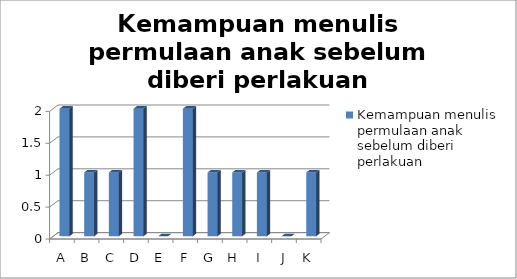
| Category | Kemampuan menulis permulaan anak sebelum diberi perlakuan |
|---|---|
| A | 2 |
| B | 1 |
| C | 1 |
| D | 2 |
| E | 0 |
| F | 2 |
| G | 1 |
| H | 1 |
| I | 1 |
| J | 0 |
| K | 1 |